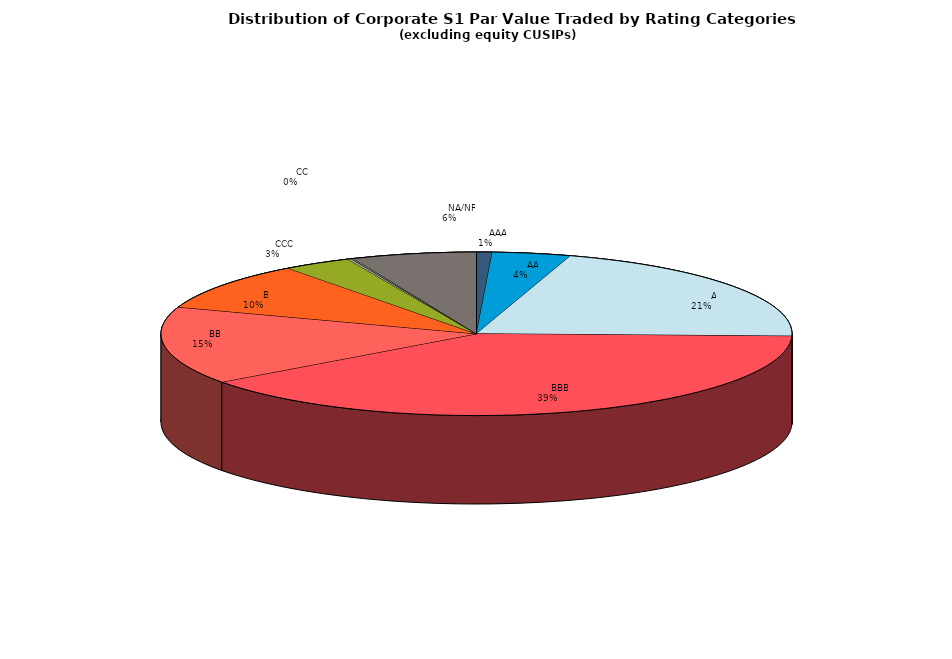
| Category | Series 0 |
|---|---|
|         AAA | 296531243.393 |
|         AA | 1487424579.982 |
|         A | 7631852963.233 |
|         BBB | 14608215537.012 |
|         BB | 5679361520.867 |
|         B | 3520599066.552 |
|         CCC | 1288658491.633 |
|         CC | 71123523.103 |
|         C | 16605188.492 |
|         D | 30028305.778 |
|         NA/NR | 2359537123.942 |